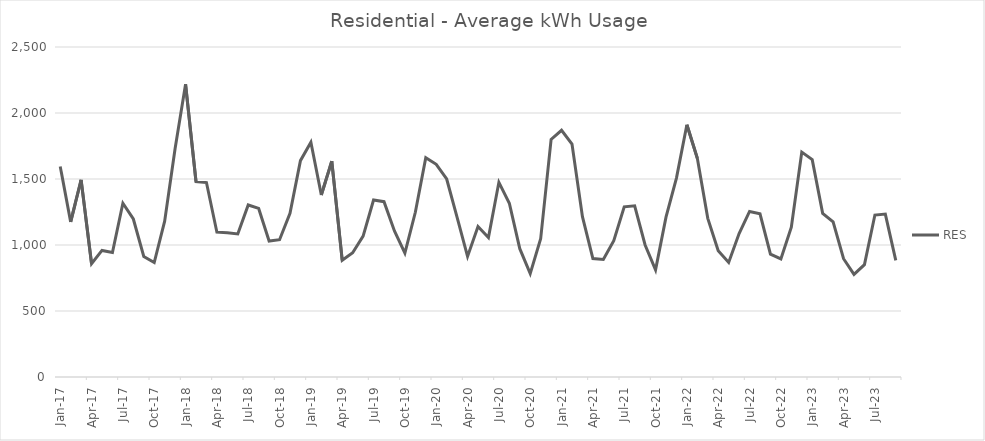
| Category | RES |
|---|---|
| 2017-01-01 | 1594 |
| 2017-02-01 | 1175 |
| 2017-03-01 | 1493 |
| 2017-04-01 | 858 |
| 2017-05-01 | 959 |
| 2017-06-01 | 943 |
| 2017-07-01 | 1316 |
| 2017-08-01 | 1197 |
| 2017-09-01 | 913 |
| 2017-10-01 | 867 |
| 2017-11-01 | 1181 |
| 2017-12-01 | 1731 |
| 2018-01-01 | 2218 |
| 2018-02-01 | 1481 |
| 2018-03-01 | 1473 |
| 2018-04-01 | 1097 |
| 2018-05-01 | 1092 |
| 2018-06-01 | 1084 |
| 2018-07-01 | 1303 |
| 2018-08-01 | 1277 |
| 2018-09-01 | 1030 |
| 2018-10-01 | 1040 |
| 2018-11-01 | 1240 |
| 2018-12-01 | 1639 |
| 2019-01-01 | 1779 |
| 2019-02-01 | 1379 |
| 2019-03-01 | 1635 |
| 2019-04-01 | 884 |
| 2019-05-01 | 941 |
| 2019-06-01 | 1067 |
| 2019-07-01 | 1341 |
| 2019-08-01 | 1328 |
| 2019-09-01 | 1106 |
| 2019-10-01 | 938 |
| 2019-11-01 | 1248 |
| 2019-12-01 | 1661 |
| 2020-01-01 | 1611 |
| 2020-02-01 | 1500 |
| 2020-03-01 | 1209 |
| 2020-04-01 | 913 |
| 2020-05-01 | 1140 |
| 2020-06-01 | 1057 |
| 2020-07-01 | 1475 |
| 2020-08-01 | 1316 |
| 2020-09-01 | 972 |
| 2020-10-01 | 783 |
| 2020-11-01 | 1047 |
| 2020-12-01 | 1800 |
| 2021-01-01 | 1869 |
| 2021-02-01 | 1765 |
| 2021-03-01 | 1215 |
| 2021-04-01 | 897 |
| 2021-05-01 | 891 |
| 2021-06-01 | 1032 |
| 2021-07-01 | 1289 |
| 2021-08-01 | 1297 |
| 2021-09-01 | 1000 |
| 2021-10-01 | 812 |
| 2021-11-01 | 1211 |
| 2021-12-01 | 1507 |
| 2022-01-01 | 1911 |
| 2022-02-01 | 1657 |
| 2022-03-01 | 1202 |
| 2022-04-01 | 956 |
| 2022-05-01 | 868 |
| 2022-06-01 | 1087 |
| 2022-07-01 | 1254 |
| 2022-08-01 | 1236 |
| 2022-09-01 | 930 |
| 2022-10-01 | 895 |
| 2022-11-01 | 1135 |
| 2022-12-01 | 1704 |
| 2023-01-01 | 1647 |
| 2023-02-01 | 1240 |
| 2023-03-01 | 1175 |
| 2023-04-01 | 896 |
| 2023-05-01 | 777 |
| 2023-06-01 | 851 |
| 2023-07-01 | 1227 |
| 2023-08-01 | 1234 |
| 2023-09-01 | 883 |